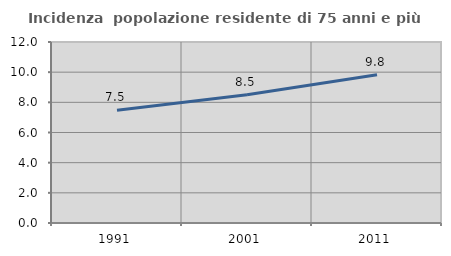
| Category | Incidenza  popolazione residente di 75 anni e più |
|---|---|
| 1991.0 | 7.481 |
| 2001.0 | 8.499 |
| 2011.0 | 9.826 |